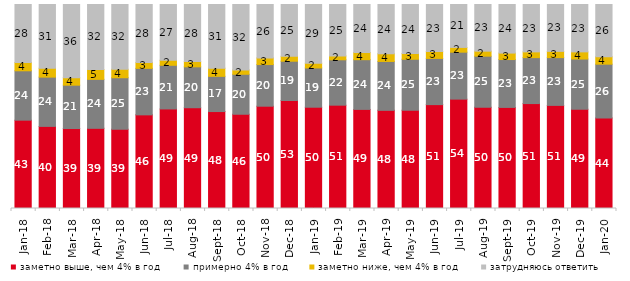
| Category | заметно выше, чем 4% в год | примерно 4% в год | заметно ниже, чем 4% в год | затрудняюсь ответить |
|---|---|---|---|---|
| 2018-01-01 | 43.3 | 24.2 | 4.05 | 28.45 |
| 2018-02-01 | 40.25 | 24.15 | 4.35 | 31.25 |
| 2018-03-01 | 39.2 | 21.25 | 3.7 | 35.85 |
| 2018-04-01 | 39.3 | 24 | 4.85 | 31.85 |
| 2018-05-01 | 38.8 | 25.3 | 4.15 | 31.75 |
| 2018-06-01 | 45.9 | 22.8 | 2.85 | 28.45 |
| 2018-07-01 | 48.8 | 21.4 | 2.45 | 27.35 |
| 2018-08-01 | 49.4 | 20.05 | 2.55 | 28 |
| 2018-09-01 | 47.5 | 17.25 | 4 | 31.2 |
| 2018-10-01 | 46.2 | 19.6 | 2.15 | 32.05 |
| 2018-11-01 | 50.15 | 20.409 | 3.244 | 26.198 |
| 2018-12-01 | 52.95 | 19.25 | 2.4 | 25.4 |
| 2019-01-01 | 49.65 | 19.25 | 2.3 | 28.8 |
| 2019-02-01 | 50.65 | 22.25 | 1.9 | 25.2 |
| 2019-03-01 | 48.583 | 24.366 | 3.531 | 23.521 |
| 2019-04-01 | 48.119 | 23.96 | 3.762 | 24.158 |
| 2019-05-01 | 48.143 | 25.012 | 2.823 | 24.022 |
| 2019-06-01 | 50.923 | 22.643 | 3.392 | 23.042 |
| 2019-07-01 | 53.614 | 23.02 | 2.327 | 21.04 |
| 2019-08-01 | 49.65 | 25.025 | 2.448 | 22.877 |
| 2019-09-01 | 49.554 | 23.465 | 3.168 | 23.812 |
| 2019-10-01 | 51.436 | 22.525 | 2.822 | 23.218 |
| 2019-11-01 | 50.545 | 23.416 | 3.069 | 22.97 |
| 2019-12-01 | 48.663 | 24.604 | 3.515 | 23.218 |
| 2020-01-01 | 44.307 | 26.436 | 3.614 | 25.644 |